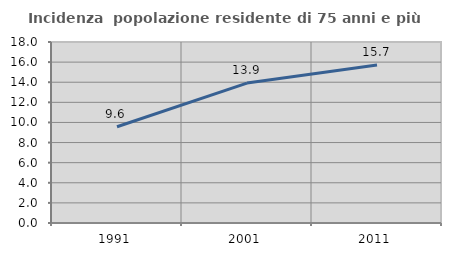
| Category | Incidenza  popolazione residente di 75 anni e più |
|---|---|
| 1991.0 | 9.576 |
| 2001.0 | 13.913 |
| 2011.0 | 15.714 |